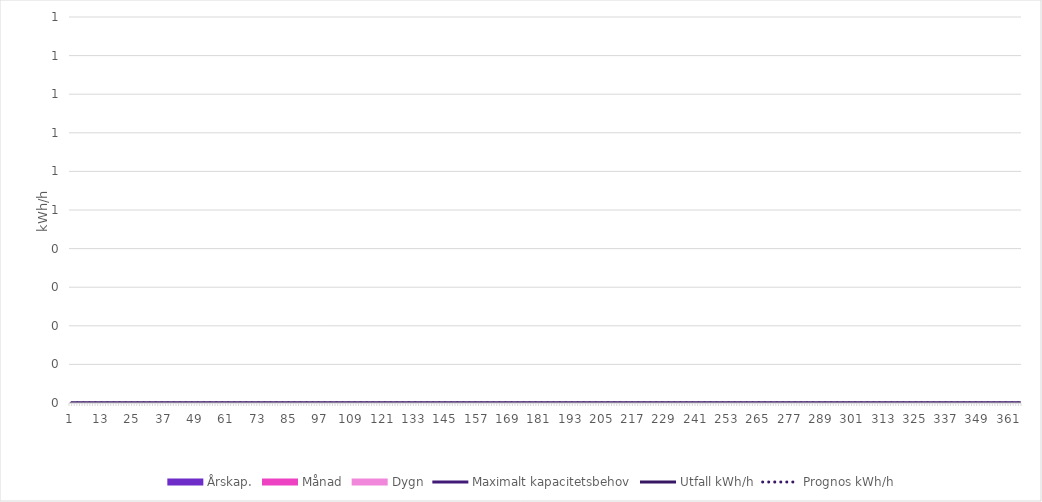
| Category | Maximalt kapacitetsbehov | Utfall | Prognos |
|---|---|---|---|
| 0 | 0 | 0 | 0 |
| 1900-01-01 | 0 | 0 | 0 |
| 1900-01-02 | 0 | 0 | 0 |
| 1900-01-03 | 0 | 0 | 0 |
| 1900-01-04 | 0 | 0 | 0 |
| 1900-01-05 | 0 | 0 | 0 |
| 1900-01-06 | 0 | 0 | 0 |
| 1900-01-07 | 0 | 0 | 0 |
| 1900-01-08 | 0 | 0 | 0 |
| 1900-01-09 | 0 | 0 | 0 |
| 1900-01-10 | 0 | 0 | 0 |
| 1900-01-11 | 0 | 0 | 0 |
| 1900-01-12 | 0 | 0 | 0 |
| 1900-01-13 | 0 | 0 | 0 |
| 1900-01-14 | 0 | 0 | 0 |
| 1900-01-15 | 0 | 0 | 0 |
| 1900-01-16 | 0 | 0 | 0 |
| 1900-01-17 | 0 | 0 | 0 |
| 1900-01-18 | 0 | 0 | 0 |
| 1900-01-19 | 0 | 0 | 0 |
| 1900-01-20 | 0 | 0 | 0 |
| 1900-01-21 | 0 | 0 | 0 |
| 1900-01-22 | 0 | 0 | 0 |
| 1900-01-23 | 0 | 0 | 0 |
| 1900-01-24 | 0 | 0 | 0 |
| 1900-01-25 | 0 | 0 | 0 |
| 1900-01-26 | 0 | 0 | 0 |
| 1900-01-27 | 0 | 0 | 0 |
| 1900-01-28 | 0 | 0 | 0 |
| 1900-01-29 | 0 | 0 | 0 |
| 1900-01-30 | 0 | 0 | 0 |
| 1900-01-31 | 0 | 0 | 0 |
| 1900-02-01 | 0 | 0 | 0 |
| 1900-02-02 | 0 | 0 | 0 |
| 1900-02-03 | 0 | 0 | 0 |
| 1900-02-04 | 0 | 0 | 0 |
| 1900-02-05 | 0 | 0 | 0 |
| 1900-02-06 | 0 | 0 | 0 |
| 1900-02-07 | 0 | 0 | 0 |
| 1900-02-08 | 0 | 0 | 0 |
| 1900-02-09 | 0 | 0 | 0 |
| 1900-02-10 | 0 | 0 | 0 |
| 1900-02-11 | 0 | 0 | 0 |
| 1900-02-12 | 0 | 0 | 0 |
| 1900-02-13 | 0 | 0 | 0 |
| 1900-02-14 | 0 | 0 | 0 |
| 1900-02-15 | 0 | 0 | 0 |
| 1900-02-16 | 0 | 0 | 0 |
| 1900-02-17 | 0 | 0 | 0 |
| 1900-02-18 | 0 | 0 | 0 |
| 1900-02-19 | 0 | 0 | 0 |
| 1900-02-20 | 0 | 0 | 0 |
| 1900-02-21 | 0 | 0 | 0 |
| 1900-02-22 | 0 | 0 | 0 |
| 1900-02-23 | 0 | 0 | 0 |
| 1900-02-24 | 0 | 0 | 0 |
| 1900-02-25 | 0 | 0 | 0 |
| 1900-02-26 | 0 | 0 | 0 |
| 1900-02-27 | 0 | 0 | 0 |
| 1900-02-28 | 0 | 0 | 0 |
| 1900-02-28 | 0 | 0 | 0 |
| 1900-03-01 | 0 | 0 | 0 |
| 1900-03-02 | 0 | 0 | 0 |
| 1900-03-03 | 0 | 0 | 0 |
| 1900-03-04 | 0 | 0 | 0 |
| 1900-03-05 | 0 | 0 | 0 |
| 1900-03-06 | 0 | 0 | 0 |
| 1900-03-07 | 0 | 0 | 0 |
| 1900-03-08 | 0 | 0 | 0 |
| 1900-03-09 | 0 | 0 | 0 |
| 1900-03-10 | 0 | 0 | 0 |
| 1900-03-11 | 0 | 0 | 0 |
| 1900-03-12 | 0 | 0 | 0 |
| 1900-03-13 | 0 | 0 | 0 |
| 1900-03-14 | 0 | 0 | 0 |
| 1900-03-15 | 0 | 0 | 0 |
| 1900-03-16 | 0 | 0 | 0 |
| 1900-03-17 | 0 | 0 | 0 |
| 1900-03-18 | 0 | 0 | 0 |
| 1900-03-19 | 0 | 0 | 0 |
| 1900-03-20 | 0 | 0 | 0 |
| 1900-03-21 | 0 | 0 | 0 |
| 1900-03-22 | 0 | 0 | 0 |
| 1900-03-23 | 0 | 0 | 0 |
| 1900-03-24 | 0 | 0 | 0 |
| 1900-03-25 | 0 | 0 | 0 |
| 1900-03-26 | 0 | 0 | 0 |
| 1900-03-27 | 0 | 0 | 0 |
| 1900-03-28 | 0 | 0 | 0 |
| 1900-03-29 | 0 | 0 | 0 |
| 1900-03-30 | 0 | 0 | 0 |
| 1900-03-31 | 0 | 0 | 0 |
| 1900-04-01 | 0 | 0 | 0 |
| 1900-04-02 | 0 | 0 | 0 |
| 1900-04-03 | 0 | 0 | 0 |
| 1900-04-04 | 0 | 0 | 0 |
| 1900-04-05 | 0 | 0 | 0 |
| 1900-04-06 | 0 | 0 | 0 |
| 1900-04-07 | 0 | 0 | 0 |
| 1900-04-08 | 0 | 0 | 0 |
| 1900-04-09 | 0 | 0 | 0 |
| 1900-04-10 | 0 | 0 | 0 |
| 1900-04-11 | 0 | 0 | 0 |
| 1900-04-12 | 0 | 0 | 0 |
| 1900-04-13 | 0 | 0 | 0 |
| 1900-04-14 | 0 | 0 | 0 |
| 1900-04-15 | 0 | 0 | 0 |
| 1900-04-16 | 0 | 0 | 0 |
| 1900-04-17 | 0 | 0 | 0 |
| 1900-04-18 | 0 | 0 | 0 |
| 1900-04-19 | 0 | 0 | 0 |
| 1900-04-20 | 0 | 0 | 0 |
| 1900-04-21 | 0 | 0 | 0 |
| 1900-04-22 | 0 | 0 | 0 |
| 1900-04-23 | 0 | 0 | 0 |
| 1900-04-24 | 0 | 0 | 0 |
| 1900-04-25 | 0 | 0 | 0 |
| 1900-04-26 | 0 | 0 | 0 |
| 1900-04-27 | 0 | 0 | 0 |
| 1900-04-28 | 0 | 0 | 0 |
| 1900-04-29 | 0 | 0 | 0 |
| 1900-04-30 | 0 | 0 | 0 |
| 1900-05-01 | 0 | 0 | 0 |
| 1900-05-02 | 0 | 0 | 0 |
| 1900-05-03 | 0 | 0 | 0 |
| 1900-05-04 | 0 | 0 | 0 |
| 1900-05-05 | 0 | 0 | 0 |
| 1900-05-06 | 0 | 0 | 0 |
| 1900-05-07 | 0 | 0 | 0 |
| 1900-05-08 | 0 | 0 | 0 |
| 1900-05-09 | 0 | 0 | 0 |
| 1900-05-10 | 0 | 0 | 0 |
| 1900-05-11 | 0 | 0 | 0 |
| 1900-05-12 | 0 | 0 | 0 |
| 1900-05-13 | 0 | 0 | 0 |
| 1900-05-14 | 0 | 0 | 0 |
| 1900-05-15 | 0 | 0 | 0 |
| 1900-05-16 | 0 | 0 | 0 |
| 1900-05-17 | 0 | 0 | 0 |
| 1900-05-18 | 0 | 0 | 0 |
| 1900-05-19 | 0 | 0 | 0 |
| 1900-05-20 | 0 | 0 | 0 |
| 1900-05-21 | 0 | 0 | 0 |
| 1900-05-22 | 0 | 0 | 0 |
| 1900-05-23 | 0 | 0 | 0 |
| 1900-05-24 | 0 | 0 | 0 |
| 1900-05-25 | 0 | 0 | 0 |
| 1900-05-26 | 0 | 0 | 0 |
| 1900-05-27 | 0 | 0 | 0 |
| 1900-05-28 | 0 | 0 | 0 |
| 1900-05-29 | 0 | 0 | 0 |
| 1900-05-30 | 0 | 0 | 0 |
| 1900-05-31 | 0 | 0 | 0 |
| 1900-06-01 | 0 | 0 | 0 |
| 1900-06-02 | 0 | 0 | 0 |
| 1900-06-03 | 0 | 0 | 0 |
| 1900-06-04 | 0 | 0 | 0 |
| 1900-06-05 | 0 | 0 | 0 |
| 1900-06-06 | 0 | 0 | 0 |
| 1900-06-07 | 0 | 0 | 0 |
| 1900-06-08 | 0 | 0 | 0 |
| 1900-06-09 | 0 | 0 | 0 |
| 1900-06-10 | 0 | 0 | 0 |
| 1900-06-11 | 0 | 0 | 0 |
| 1900-06-12 | 0 | 0 | 0 |
| 1900-06-13 | 0 | 0 | 0 |
| 1900-06-14 | 0 | 0 | 0 |
| 1900-06-15 | 0 | 0 | 0 |
| 1900-06-16 | 0 | 0 | 0 |
| 1900-06-17 | 0 | 0 | 0 |
| 1900-06-18 | 0 | 0 | 0 |
| 1900-06-19 | 0 | 0 | 0 |
| 1900-06-20 | 0 | 0 | 0 |
| 1900-06-21 | 0 | 0 | 0 |
| 1900-06-22 | 0 | 0 | 0 |
| 1900-06-23 | 0 | 0 | 0 |
| 1900-06-24 | 0 | 0 | 0 |
| 1900-06-25 | 0 | 0 | 0 |
| 1900-06-26 | 0 | 0 | 0 |
| 1900-06-27 | 0 | 0 | 0 |
| 1900-06-28 | 0 | 0 | 0 |
| 1900-06-29 | 0 | 0 | 0 |
| 1900-06-30 | 0 | 0 | 0 |
| 1900-07-01 | 0 | 0 | 0 |
| 1900-07-02 | 0 | 0 | 0 |
| 1900-07-03 | 0 | 0 | 0 |
| 1900-07-04 | 0 | 0 | 0 |
| 1900-07-05 | 0 | 0 | 0 |
| 1900-07-06 | 0 | 0 | 0 |
| 1900-07-07 | 0 | 0 | 0 |
| 1900-07-08 | 0 | 0 | 0 |
| 1900-07-09 | 0 | 0 | 0 |
| 1900-07-10 | 0 | 0 | 0 |
| 1900-07-11 | 0 | 0 | 0 |
| 1900-07-12 | 0 | 0 | 0 |
| 1900-07-13 | 0 | 0 | 0 |
| 1900-07-14 | 0 | 0 | 0 |
| 1900-07-15 | 0 | 0 | 0 |
| 1900-07-16 | 0 | 0 | 0 |
| 1900-07-17 | 0 | 0 | 0 |
| 1900-07-18 | 0 | 0 | 0 |
| 1900-07-19 | 0 | 0 | 0 |
| 1900-07-20 | 0 | 0 | 0 |
| 1900-07-21 | 0 | 0 | 0 |
| 1900-07-22 | 0 | 0 | 0 |
| 1900-07-23 | 0 | 0 | 0 |
| 1900-07-24 | 0 | 0 | 0 |
| 1900-07-25 | 0 | 0 | 0 |
| 1900-07-26 | 0 | 0 | 0 |
| 1900-07-27 | 0 | 0 | 0 |
| 1900-07-28 | 0 | 0 | 0 |
| 1900-07-29 | 0 | 0 | 0 |
| 1900-07-30 | 0 | 0 | 0 |
| 1900-07-31 | 0 | 0 | 0 |
| 1900-08-01 | 0 | 0 | 0 |
| 1900-08-02 | 0 | 0 | 0 |
| 1900-08-03 | 0 | 0 | 0 |
| 1900-08-04 | 0 | 0 | 0 |
| 1900-08-05 | 0 | 0 | 0 |
| 1900-08-06 | 0 | 0 | 0 |
| 1900-08-07 | 0 | 0 | 0 |
| 1900-08-08 | 0 | 0 | 0 |
| 1900-08-09 | 0 | 0 | 0 |
| 1900-08-10 | 0 | 0 | 0 |
| 1900-08-11 | 0 | 0 | 0 |
| 1900-08-12 | 0 | 0 | 0 |
| 1900-08-13 | 0 | 0 | 0 |
| 1900-08-14 | 0 | 0 | 0 |
| 1900-08-15 | 0 | 0 | 0 |
| 1900-08-16 | 0 | 0 | 0 |
| 1900-08-17 | 0 | 0 | 0 |
| 1900-08-18 | 0 | 0 | 0 |
| 1900-08-19 | 0 | 0 | 0 |
| 1900-08-20 | 0 | 0 | 0 |
| 1900-08-21 | 0 | 0 | 0 |
| 1900-08-22 | 0 | 0 | 0 |
| 1900-08-23 | 0 | 0 | 0 |
| 1900-08-24 | 0 | 0 | 0 |
| 1900-08-25 | 0 | 0 | 0 |
| 1900-08-26 | 0 | 0 | 0 |
| 1900-08-27 | 0 | 0 | 0 |
| 1900-08-28 | 0 | 0 | 0 |
| 1900-08-29 | 0 | 0 | 0 |
| 1900-08-30 | 0 | 0 | 0 |
| 1900-08-31 | 0 | 0 | 0 |
| 1900-09-01 | 0 | 0 | 0 |
| 1900-09-02 | 0 | 0 | 0 |
| 1900-09-03 | 0 | 0 | 0 |
| 1900-09-04 | 0 | 0 | 0 |
| 1900-09-05 | 0 | 0 | 0 |
| 1900-09-06 | 0 | 0 | 0 |
| 1900-09-07 | 0 | 0 | 0 |
| 1900-09-08 | 0 | 0 | 0 |
| 1900-09-09 | 0 | 0 | 0 |
| 1900-09-10 | 0 | 0 | 0 |
| 1900-09-11 | 0 | 0 | 0 |
| 1900-09-12 | 0 | 0 | 0 |
| 1900-09-13 | 0 | 0 | 0 |
| 1900-09-14 | 0 | 0 | 0 |
| 1900-09-15 | 0 | 0 | 0 |
| 1900-09-16 | 0 | 0 | 0 |
| 1900-09-17 | 0 | 0 | 0 |
| 1900-09-18 | 0 | 0 | 0 |
| 1900-09-19 | 0 | 0 | 0 |
| 1900-09-20 | 0 | 0 | 0 |
| 1900-09-21 | 0 | 0 | 0 |
| 1900-09-22 | 0 | 0 | 0 |
| 1900-09-23 | 0 | 0 | 0 |
| 1900-09-24 | 0 | 0 | 0 |
| 1900-09-25 | 0 | 0 | 0 |
| 1900-09-26 | 0 | 0 | 0 |
| 1900-09-27 | 0 | 0 | 0 |
| 1900-09-28 | 0 | 0 | 0 |
| 1900-09-29 | 0 | 0 | 0 |
| 1900-09-30 | 0 | 0 | 0 |
| 1900-10-01 | 0 | 0 | 0 |
| 1900-10-02 | 0 | 0 | 0 |
| 1900-10-03 | 0 | 0 | 0 |
| 1900-10-04 | 0 | 0 | 0 |
| 1900-10-05 | 0 | 0 | 0 |
| 1900-10-06 | 0 | 0 | 0 |
| 1900-10-07 | 0 | 0 | 0 |
| 1900-10-08 | 0 | 0 | 0 |
| 1900-10-09 | 0 | 0 | 0 |
| 1900-10-10 | 0 | 0 | 0 |
| 1900-10-11 | 0 | 0 | 0 |
| 1900-10-12 | 0 | 0 | 0 |
| 1900-10-13 | 0 | 0 | 0 |
| 1900-10-14 | 0 | 0 | 0 |
| 1900-10-15 | 0 | 0 | 0 |
| 1900-10-16 | 0 | 0 | 0 |
| 1900-10-17 | 0 | 0 | 0 |
| 1900-10-18 | 0 | 0 | 0 |
| 1900-10-19 | 0 | 0 | 0 |
| 1900-10-20 | 0 | 0 | 0 |
| 1900-10-21 | 0 | 0 | 0 |
| 1900-10-22 | 0 | 0 | 0 |
| 1900-10-23 | 0 | 0 | 0 |
| 1900-10-24 | 0 | 0 | 0 |
| 1900-10-25 | 0 | 0 | 0 |
| 1900-10-26 | 0 | 0 | 0 |
| 1900-10-27 | 0 | 0 | 0 |
| 1900-10-28 | 0 | 0 | 0 |
| 1900-10-29 | 0 | 0 | 0 |
| 1900-10-30 | 0 | 0 | 0 |
| 1900-10-31 | 0 | 0 | 0 |
| 1900-11-01 | 0 | 0 | 0 |
| 1900-11-02 | 0 | 0 | 0 |
| 1900-11-03 | 0 | 0 | 0 |
| 1900-11-04 | 0 | 0 | 0 |
| 1900-11-05 | 0 | 0 | 0 |
| 1900-11-06 | 0 | 0 | 0 |
| 1900-11-07 | 0 | 0 | 0 |
| 1900-11-08 | 0 | 0 | 0 |
| 1900-11-09 | 0 | 0 | 0 |
| 1900-11-10 | 0 | 0 | 0 |
| 1900-11-11 | 0 | 0 | 0 |
| 1900-11-12 | 0 | 0 | 0 |
| 1900-11-13 | 0 | 0 | 0 |
| 1900-11-14 | 0 | 0 | 0 |
| 1900-11-15 | 0 | 0 | 0 |
| 1900-11-16 | 0 | 0 | 0 |
| 1900-11-17 | 0 | 0 | 0 |
| 1900-11-18 | 0 | 0 | 0 |
| 1900-11-19 | 0 | 0 | 0 |
| 1900-11-20 | 0 | 0 | 0 |
| 1900-11-21 | 0 | 0 | 0 |
| 1900-11-22 | 0 | 0 | 0 |
| 1900-11-23 | 0 | 0 | 0 |
| 1900-11-24 | 0 | 0 | 0 |
| 1900-11-25 | 0 | 0 | 0 |
| 1900-11-26 | 0 | 0 | 0 |
| 1900-11-27 | 0 | 0 | 0 |
| 1900-11-28 | 0 | 0 | 0 |
| 1900-11-29 | 0 | 0 | 0 |
| 1900-11-30 | 0 | 0 | 0 |
| 1900-12-01 | 0 | 0 | 0 |
| 1900-12-02 | 0 | 0 | 0 |
| 1900-12-03 | 0 | 0 | 0 |
| 1900-12-04 | 0 | 0 | 0 |
| 1900-12-05 | 0 | 0 | 0 |
| 1900-12-06 | 0 | 0 | 0 |
| 1900-12-07 | 0 | 0 | 0 |
| 1900-12-08 | 0 | 0 | 0 |
| 1900-12-09 | 0 | 0 | 0 |
| 1900-12-10 | 0 | 0 | 0 |
| 1900-12-11 | 0 | 0 | 0 |
| 1900-12-12 | 0 | 0 | 0 |
| 1900-12-13 | 0 | 0 | 0 |
| 1900-12-14 | 0 | 0 | 0 |
| 1900-12-15 | 0 | 0 | 0 |
| 1900-12-16 | 0 | 0 | 0 |
| 1900-12-17 | 0 | 0 | 0 |
| 1900-12-18 | 0 | 0 | 0 |
| 1900-12-19 | 0 | 0 | 0 |
| 1900-12-20 | 0 | 0 | 0 |
| 1900-12-21 | 0 | 0 | 0 |
| 1900-12-22 | 0 | 0 | 0 |
| 1900-12-23 | 0 | 0 | 0 |
| 1900-12-24 | 0 | 0 | 0 |
| 1900-12-25 | 0 | 0 | 0 |
| 1900-12-26 | 0 | 0 | 0 |
| 1900-12-27 | 0 | 0 | 0 |
| 1900-12-28 | 0 | 0 | 0 |
| 1900-12-29 | 0 | 0 | 0 |